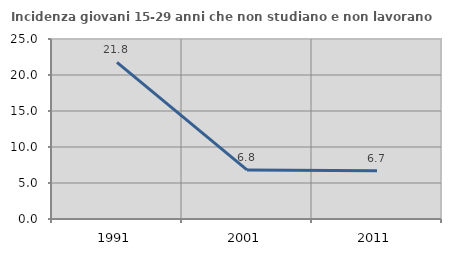
| Category | Incidenza giovani 15-29 anni che non studiano e non lavorano  |
|---|---|
| 1991.0 | 21.761 |
| 2001.0 | 6.81 |
| 2011.0 | 6.689 |